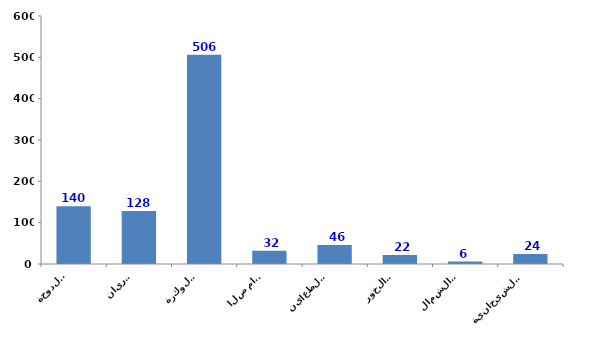
| Category | Series 0 |
|---|---|
| الدوحة
Doha | 140 |
| الريان
Rayyan | 128 |
| الوكرة
Wakrah | 506 |
| ام صلال
Umm Slal | 32 |
| الظعاين
Al-Daayen | 46 |
| الخور
Al-Khor | 22 |
| الشمال
Al-Shamal | 6 |
| الشيحانية
Al-Shahhaniya | 24 |